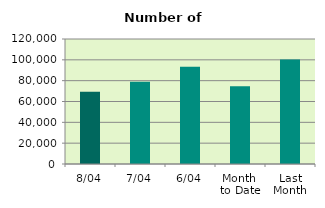
| Category | Series 0 |
|---|---|
| 8/04 | 69436 |
| 7/04 | 79040 |
| 6/04 | 93334 |
| Month 
to Date | 74715.333 |
| Last
Month | 100276.783 |